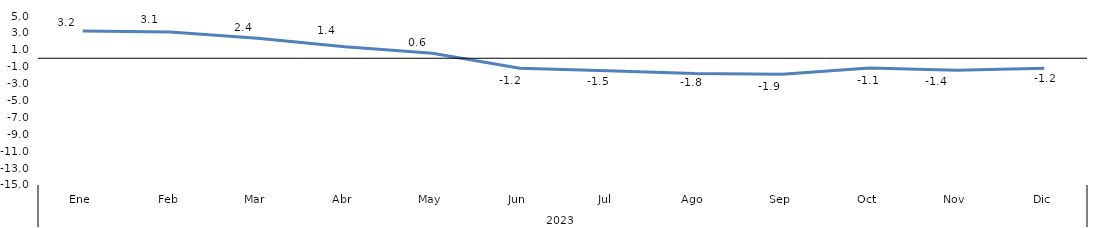
| Category | Bogotá |
|---|---|
| 0 | 3.225 |
| 1 | 3.113 |
| 2 | 2.357 |
| 3 | 1.355 |
| 4 | 0.603 |
| 5 | -1.173 |
| 6 | -1.466 |
| 7 | -1.795 |
| 8 | -1.887 |
| 9 | -1.15 |
| 10 | -1.423 |
| 11 | -1.176 |